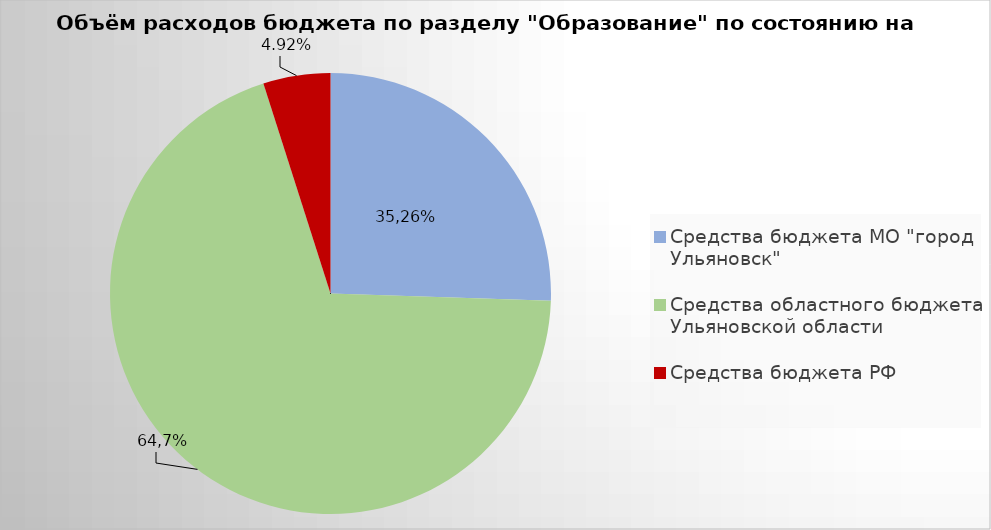
| Category | Series 0 |
|---|---|
| Средства бюджета МО "город Ульяновск" | 2187231.67 |
| Средства областного бюджета Ульяновской области | 5958563.6 |
| Средства бюджета РФ | 421600.4 |